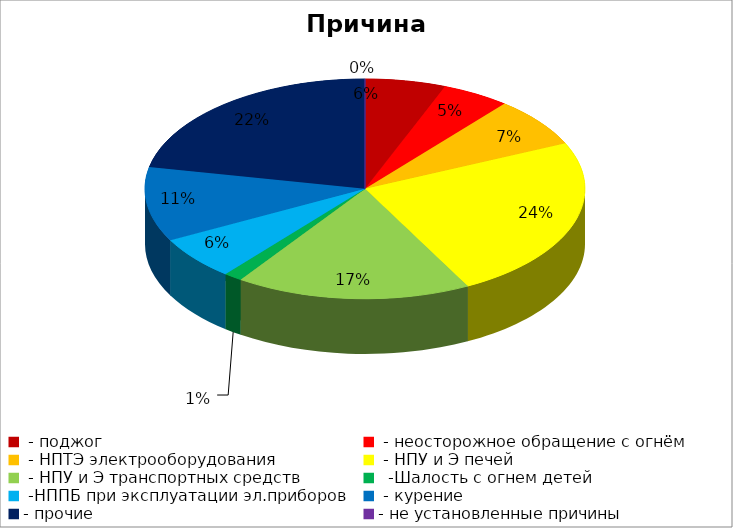
| Category | Причина пожара |
|---|---|
|  - поджог | 13 |
|  - неосторожное обращение с огнём | 11 |
|  - НПТЭ электрооборудования | 16 |
|  - НПУ и Э печей | 53 |
|  - НПУ и Э транспортных средств | 38 |
|   -Шалость с огнем детей | 3 |
|  -НППБ при эксплуатации эл.приборов | 14 |
|  - курение | 24 |
| - прочие | 48 |
| - не установленные причины | 0 |